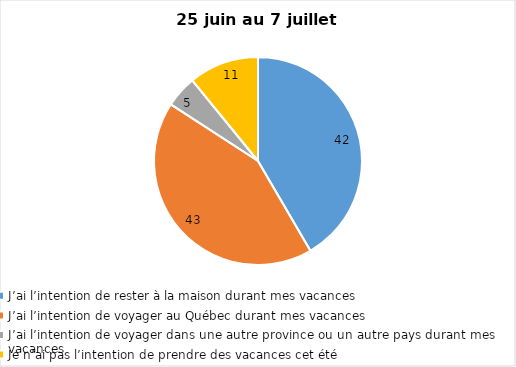
| Category | Series 0 |
|---|---|
| J’ai l’intention de rester à la maison durant mes vacances | 42 |
| J’ai l’intention de voyager au Québec durant mes vacances | 43 |
| J’ai l’intention de voyager dans une autre province ou un autre pays durant mes vacances | 5 |
| Je n’ai pas l’intention de prendre des vacances cet été | 11 |